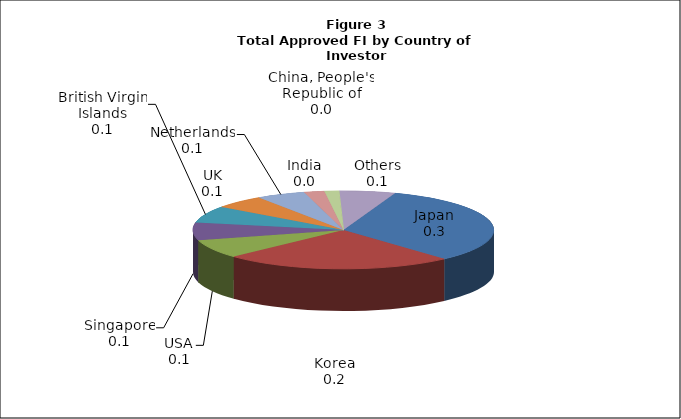
| Category | Series 0 |
|---|---|
| Japan | 0.328 |
| Korea | 0.246 |
| USA | 0.077 |
| Singapore | 0.073 |
| British Virgin Islands | 0.07 |
| UK | 0.056 |
| Netherlands | 0.052 |
| India | 0.022 |
| China, People's Republic of | 0.015 |
| Others | 0.06 |